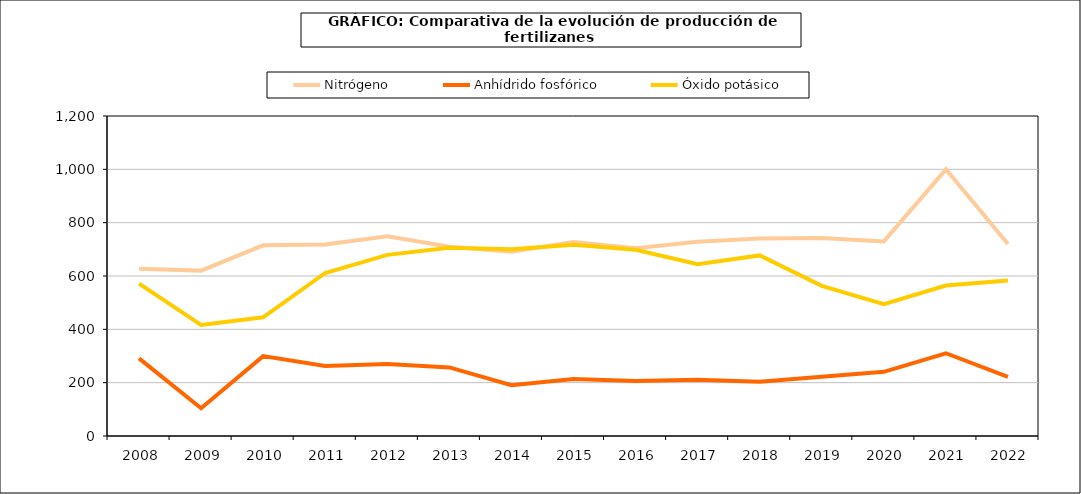
| Category | Nitrógeno | Anhídrido fosfórico | Óxido potásico |
|---|---|---|---|
|   2008 | 627.3 | 291.1 | 571.7 |
|   2009 | 620.2 | 104.3 | 416.7 |
|   2010 | 715 | 299.5 | 445.3 |
|   2011 | 718.1 | 262.6 | 611.3 |
|   2012 | 748.9 | 269.7 | 679.2 |
|   2013 | 710 | 257.1 | 706.3 |
|   2014 | 691.1 | 190.6 | 700 |
|   2015 | 727.2 | 214 | 717.2 |
|   2016 | 703.8 | 206 | 698.2 |
|   2017 | 728 | 211.3 | 643.9 |
|   2018 | 740.8 | 203.6 | 677.2 |
|   2019 | 742.4 | 222.1 | 562.9 |
|   2020 | 729.8 | 240.7 | 494.3 |
|   2021 | 1000.004 | 310.292 | 564.4 |
|   2022 | 719.817 | 221.731 | 583.261 |